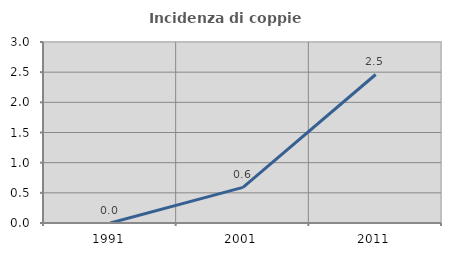
| Category | Incidenza di coppie miste |
|---|---|
| 1991.0 | 0 |
| 2001.0 | 0.59 |
| 2011.0 | 2.462 |